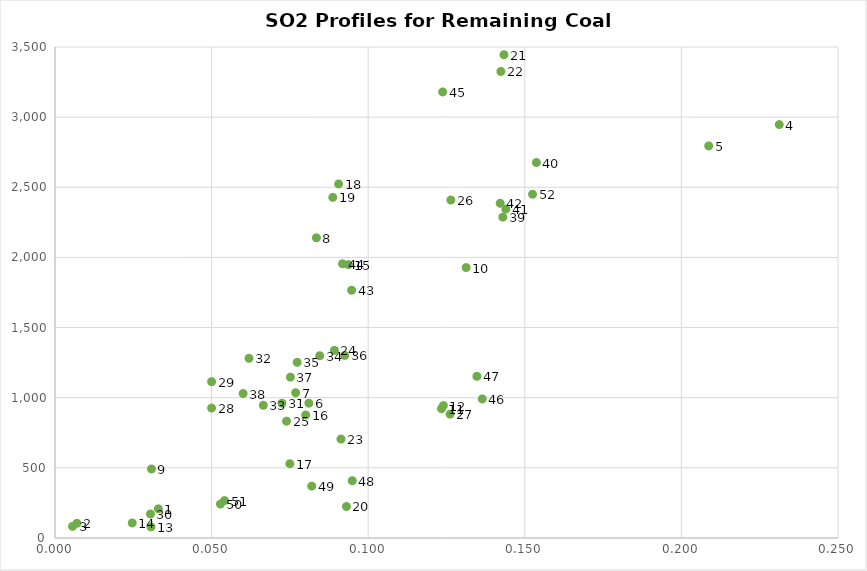
| Category | Series 0 |
|---|---|
| 0.033 | 207.907 |
| 0.007 | 104.529 |
| 0.005607369820674245 | 83.08 |
| 0.23124262817350102 | 2946.974 |
| 0.20871208924756282 | 2794.953 |
| 0.0810498185727474 | 961.081 |
| 0.07682968265546436 | 1035.511 |
| 0.08346727841075972 | 2140.058 |
| 0.03080433223314229 | 491.977 |
| 0.13127026781145235 | 1927.952 |
| 0.1234044640154891 | 921.773 |
| 0.124 | 944 |
| 0.030638568744646367 | 79.703 |
| 0.02465802776105377 | 107.109 |
| 0.09369831707109953 | 1948.653 |
| 0.08004719057984976 | 876.67 |
| 0.07498539364956465 | 529.647 |
| 0.0905593313806054 | 2523.777 |
| 0.08869681882122053 | 2428.216 |
| 0.09305988707321151 | 224.685 |
| 0.14334408579247604 | 3445.07 |
| 0.14236860845757437 | 3325.648 |
| 0.09130901431755246 | 705.005 |
| 0.08920671149619853 | 1337.541 |
| 0.07392139165452628 | 832.867 |
| 0.1263973888901594 | 2409.352 |
| 0.1261331849130449 | 883.024 |
| 0.05 | 926.218 |
| 0.05 | 1114.399 |
| 0.03047277472554212 | 170.822 |
| 0.07247716997563182 | 960.626 |
| 0.06193188373950367 | 1281.27 |
| 0.06652433406482071 | 946.138 |
| 0.08451269868815305 | 1299.412 |
| 0.07731708198578209 | 1251.989 |
| 0.09250536472725808 | 1301.36 |
| 0.07515931163711176 | 1146.839 |
| 0.060060224732075757 | 1029.791 |
| 0.1429921138717676 | 2287.368 |
| 0.15370944389692134 | 2676.6 |
| 0.14393071311786984 | 2344.061 |
| 0.14214408824081995 | 2385.958 |
| 0.09471129786018569 | 1766.06 |
| 0.09178710897902355 | 1954.744 |
| 0.12377821860716816 | 3179.652 |
| 0.13642236001237826 | 991.292 |
| 0.13469644136070255 | 1152.516 |
| 0.09491992147429142 | 408.524 |
| 0.08197898623119004 | 369.631 |
| 0.052808629331590216 | 241.845 |
| 0.05413730077042423 | 266.825 |
| 0.15247379399866304 | 2450.2 |